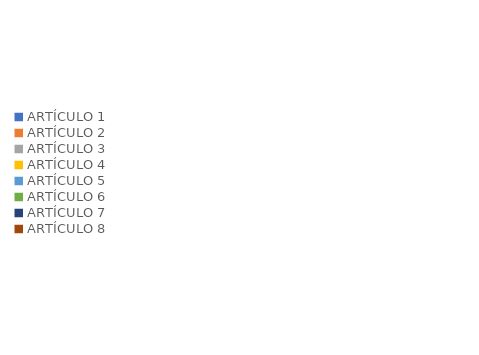
| Category | Series 0 | Series 1 |
|---|---|---|
| ARTÍCULO 1 | 0 | 0 |
| ARTÍCULO 2 | 0 | 0 |
| ARTÍCULO 3 | 0 | 0 |
| ARTÍCULO 4 | 0 | 0 |
| ARTÍCULO 5 | 0 | 0 |
| ARTÍCULO 6 | 0 | 0 |
| ARTÍCULO 7 | 0 | 0 |
| ARTÍCULO 8 | 0 | 0 |